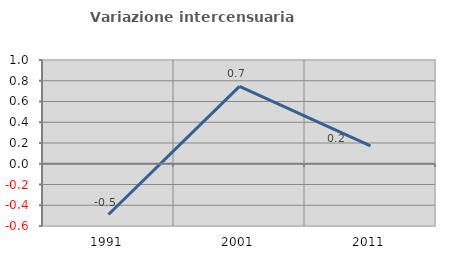
| Category | Variazione intercensuaria annua |
|---|---|
| 1991.0 | -0.489 |
| 2001.0 | 0.746 |
| 2011.0 | 0.172 |